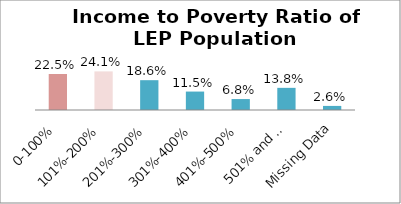
| Category | Percent |
|---|---|
| 0-100% | 0.225 |
| 101%-200% | 0.241 |
| 201%-300% | 0.186 |
| 301%-400% | 0.115 |
| 401%-500% | 0.068 |
| 501% and Over | 0.138 |
| Missing Data | 0.026 |